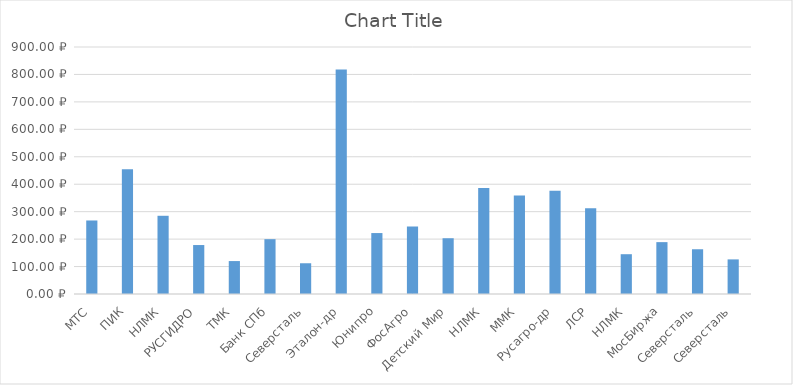
| Category | Series 0 |
|---|---|
| МТС | 267.9 |
| ПИК | 454.2 |
| НЛМК | 285 |
| РУСГИДРО | 178.4 |
| ТМК | 120 |
| Банк СПб | 199.8 |
| Северсталь | 112.02 |
| Эталон-др | 818.04 |
| Юнипро | 222.051 |
| ФосАгро | 246 |
| Детский Мир | 203.2 |
| НЛМК | 385.8 |
| ММК | 358.65 |
| Русагро-др | 375.821 |
| ЛСР | 312 |
| НЛМК | 145 |
| МосБиржа | 189 |
| Северсталь | 163.08 |
| Северсталь | 126.08 |